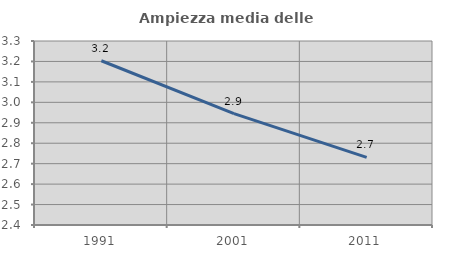
| Category | Ampiezza media delle famiglie |
|---|---|
| 1991.0 | 3.203 |
| 2001.0 | 2.945 |
| 2011.0 | 2.731 |